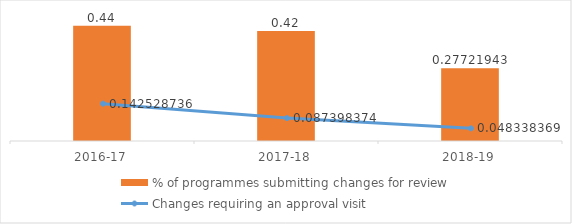
| Category | % of programmes submitting changes for review |
|---|---|
| 2016-17 | 0.44 |
| 2017-18 | 0.42 |
| 2018-19 | 0.277 |